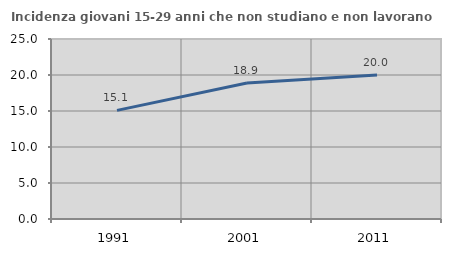
| Category | Incidenza giovani 15-29 anni che non studiano e non lavorano  |
|---|---|
| 1991.0 | 15.09 |
| 2001.0 | 18.884 |
| 2011.0 | 20 |